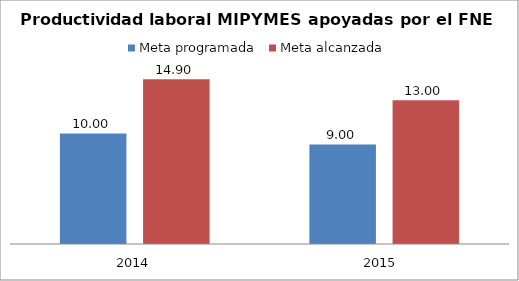
| Category | Meta programada | Meta alcanzada |
|---|---|---|
| 0 | 10 | 14.9 |
| 1 | 9 | 13 |